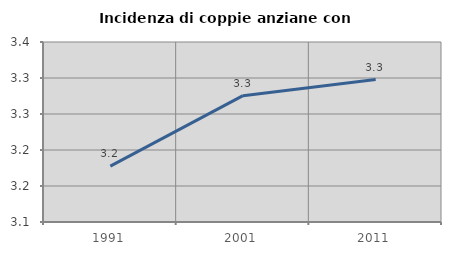
| Category | Incidenza di coppie anziane con figli |
|---|---|
| 1991.0 | 3.178 |
| 2001.0 | 3.275 |
| 2011.0 | 3.298 |